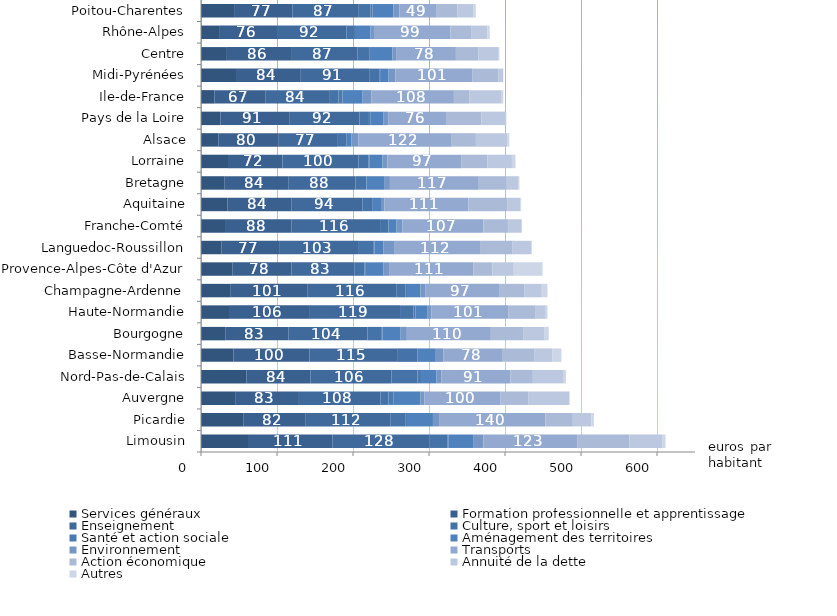
| Category | Services généraux | Formation professionnelle et apprentissage | Enseignement | Culture, sport et loisirs | Santé et action sociale | Aménagement des territoires | Environnement | Transports | Action économique | Annuité de la dette | Autres |
|---|---|---|---|---|---|---|---|---|---|---|---|
| Limousin | 61.848 | 110.933 | 127.538 | 23.795 | 1.421 | 32.485 | 13.467 | 123.474 | 68.641 | 43.749 | 3.825 |
| Picardie | 55.576 | 82.246 | 111.81 | 19.809 | 1.629 | 34.137 | 8.031 | 139.792 | 36.221 | 24.452 | 3.274 |
| Auvergne | 44.946 | 82.708 | 108.418 | 10.574 | 6.367 | 35.866 | 4.963 | 99.769 | 36.825 | 53.879 | 0.791 |
| Nord-Pas-de-Calais | 59.839 | 84.386 | 106.341 | 34.376 | 4.569 | 20.431 | 6.53 | 90.575 | 29.577 | 40.651 | 2.848 |
| Basse-Normandie | 42.682 | 99.97 | 115.358 | 26.957 | 0.548 | 22.354 | 11.274 | 77.932 | 41.151 | 24.415 | 11.615 |
| Bourgogne | 31.931 | 83.342 | 103.682 | 18.912 | 0.855 | 23.947 | 8.2 | 110.478 | 42.458 | 28.418 | 5.307 |
| Haute-Normandie | 36.843 | 106.448 | 118.611 | 17.832 | 2.535 | 15.245 | 5.443 | 101.21 | 36.262 | 13.123 | 2.387 |
| Champagne-Ardenne | 39.197 | 101.251 | 116.415 | 11.938 | 2.255 | 17.653 | 6.195 | 97.24 | 33.026 | 23.247 | 7.389 |
| Provence-Alpes-Côte d'Azur | 41.164 | 77.875 | 82.532 | 13.604 | 1.652 | 23.419 | 7.186 | 110.793 | 25.232 | 28.143 | 37.802 |
| Languedoc-Roussillon | 26.759 | 76.989 | 102.921 | 20.666 | 0.924 | 11.484 | 15.218 | 112.184 | 42.966 | 24.781 | 0.44 |
| Franche-Comté | 31.601 | 87.575 | 116.413 | 10.995 | 0.432 | 10.331 | 7.539 | 106.692 | 33.307 | 16.968 | 0.613 |
| Aquitaine | 34.974 | 83.783 | 93.917 | 13.375 | 0.194 | 10.615 | 4.303 | 110.568 | 51.072 | 17.253 | 1.184 |
| Bretagne | 31.199 | 83.552 | 88.299 | 14.575 | 0.268 | 23.868 | 6.815 | 116.955 | 36.912 | 14.844 | 1.693 |
| Lorraine | 35.532 | 71.619 | 100.127 | 13.224 | 1.002 | 17.023 | 6.915 | 96.817 | 34.515 | 32.325 | 4.645 |
| Alsace | 22.847 | 79.514 | 76.649 | 12.079 | 0.042 | 6.924 | 8.908 | 122.069 | 32.685 | 41.156 | 2.705 |
| Pays de la Loire | 25.479 | 90.534 | 92.423 | 12.521 | 2.33 | 16.425 | 6.525 | 76.096 | 46.652 | 31.491 | 1.336 |
| Ile-de-France | 17.821 | 67.353 | 84.411 | 11.3 | 5.246 | 26.627 | 11.511 | 108.493 | 20.205 | 41.862 | 2.993 |
| Midi-Pyrénées | 46.076 | 84.379 | 90.788 | 13.306 | 1.099 | 11.235 | 8.761 | 101.09 | 34.404 | 6.312 | 0.346 |
| Centre | 34.066 | 85.547 | 86.55 | 15.876 | 0 | 29.905 | 5.561 | 77.902 | 29.65 | 25.713 | 1.849 |
| Rhône-Alpes | 23.794 | 76.259 | 91.535 | 10.968 | 1.329 | 19.249 | 5.526 | 99.427 | 27.305 | 21.295 | 3.122 |
| Poitou-Charentes | 43.549 | 76.604 | 87.483 | 15.227 | 2.729 | 27.446 | 8.055 | 49.118 | 27.325 | 21.182 | 2.901 |